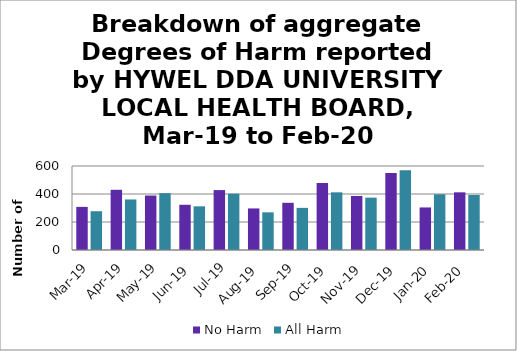
| Category | No Harm | All Harm |
|---|---|---|
| Mar-19 | 308 | 277 |
| Apr-19 | 430 | 361 |
| May-19 | 389 | 406 |
| Jun-19 | 323 | 312 |
| Jul-19 | 428 | 402 |
| Aug-19 | 297 | 269 |
| Sep-19 | 337 | 301 |
| Oct-19 | 479 | 412 |
| Nov-19 | 386 | 374 |
| Dec-19 | 550 | 570 |
| Jan-20 | 304 | 398 |
| Feb-20 | 412 | 393 |